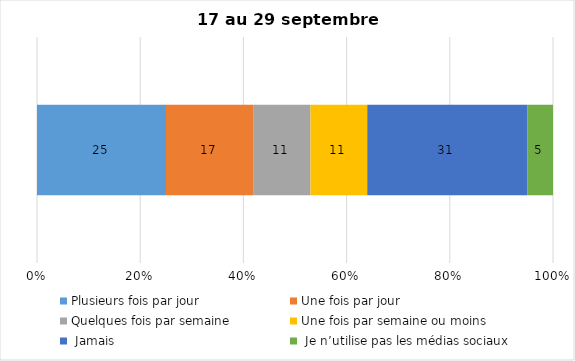
| Category | Plusieurs fois par jour | Une fois par jour | Quelques fois par semaine   | Une fois par semaine ou moins   |  Jamais   |  Je n’utilise pas les médias sociaux |
|---|---|---|---|---|---|---|
| 0 | 25 | 17 | 11 | 11 | 31 | 5 |